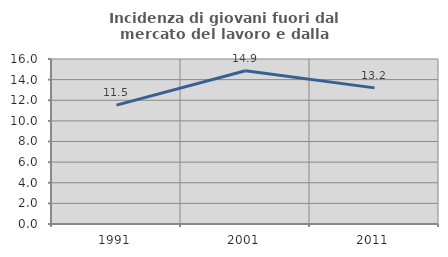
| Category | Incidenza di giovani fuori dal mercato del lavoro e dalla formazione  |
|---|---|
| 1991.0 | 11.527 |
| 2001.0 | 14.865 |
| 2011.0 | 13.2 |